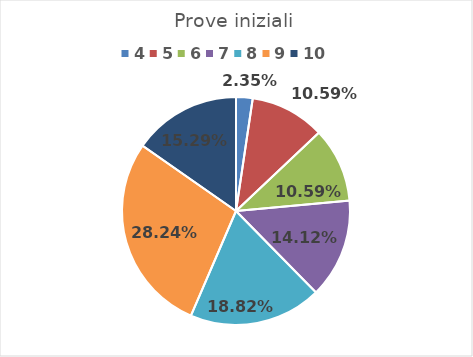
| Category | Series 0 |
|---|---|
| 4.0 | 0.024 |
| 5.0 | 0.106 |
| 6.0 | 0.106 |
| 7.0 | 0.141 |
| 8.0 | 0.188 |
| 9.0 | 0.282 |
| 10.0 | 0.153 |